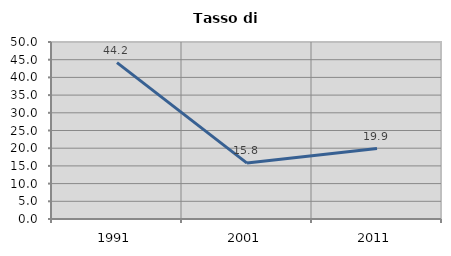
| Category | Tasso di disoccupazione   |
|---|---|
| 1991.0 | 44.167 |
| 2001.0 | 15.789 |
| 2011.0 | 19.902 |